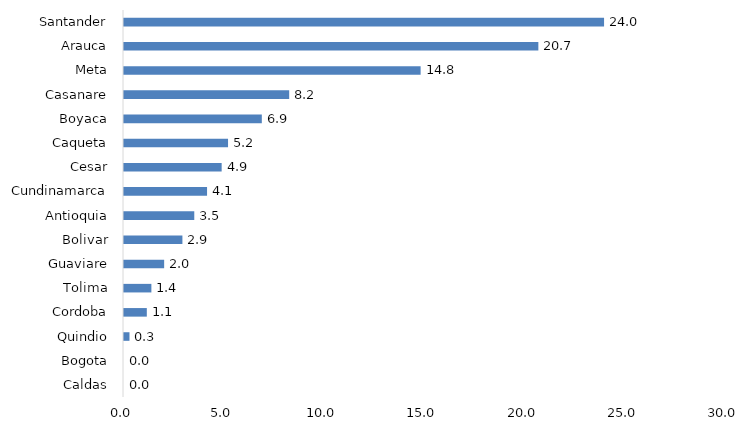
| Category | Series 0 |
|---|---|
| Caldas | 0 |
| Bogota | 0 |
| Quindio | 0.273 |
| Cordoba | 1.139 |
| Tolima | 1.367 |
| Guaviare | 2.005 |
| Bolivar | 2.916 |
| Antioquia | 3.508 |
| Cundinamarca | 4.146 |
| Cesar | 4.875 |
| Caqueta | 5.194 |
| Boyaca | 6.879 |
| Casanare | 8.246 |
| Meta | 14.806 |
| Arauca | 20.683 |
| Santander | 23.964 |